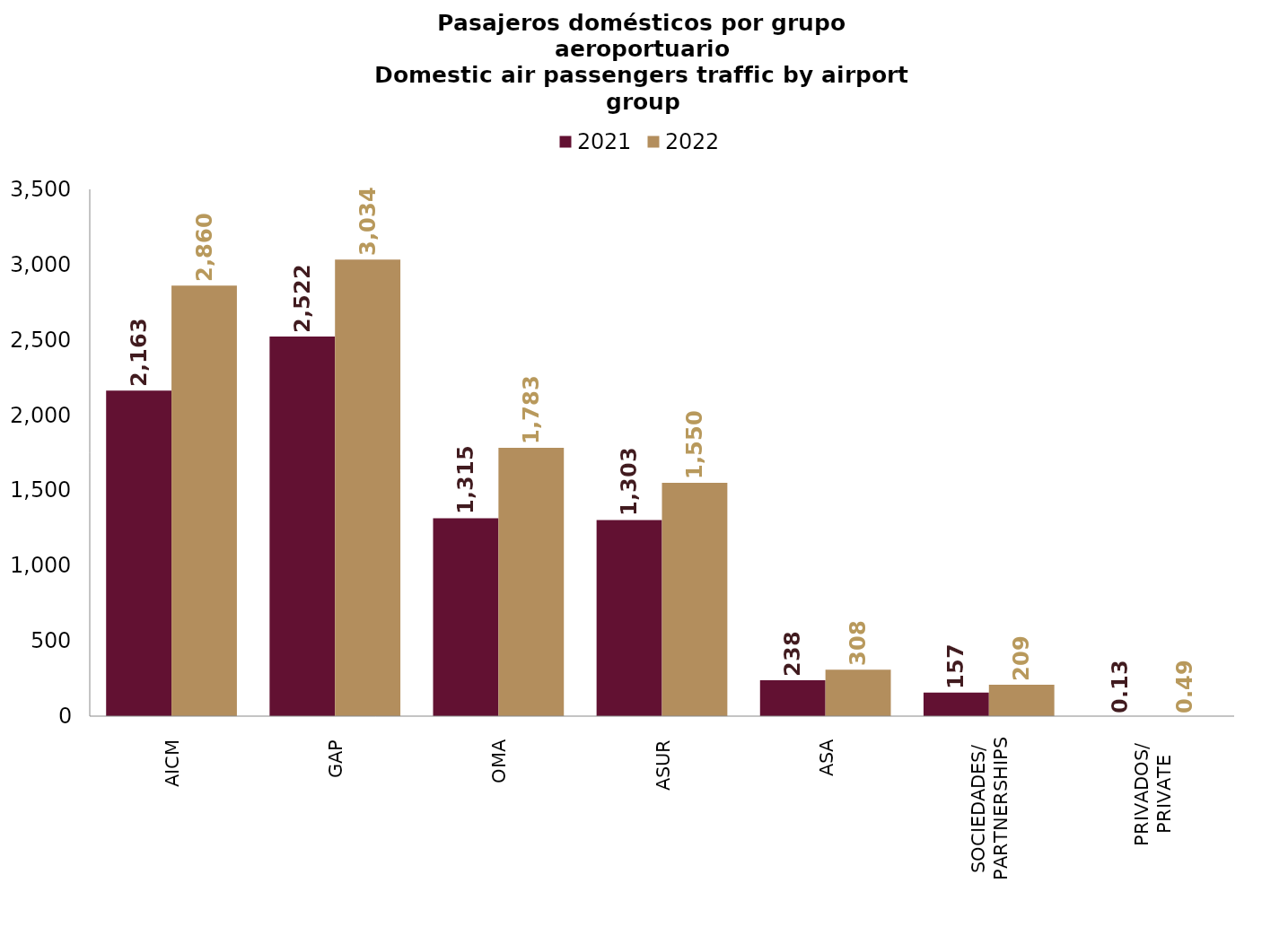
| Category | 2021 | 2022 |
|---|---|---|
| AICM | 2163.486 | 2860.006 |
| GAP | 2521.648 | 3033.653 |
| OMA | 1315.089 | 1783.166 |
| ASUR | 1302.835 | 1549.553 |
| ASA | 238.004 | 308.131 |
| SOCIEDADES/
PARTNERSHIPS | 156.539 | 208.668 |
| PRIVADOS/
PRIVATE | 0.13 | 0.493 |